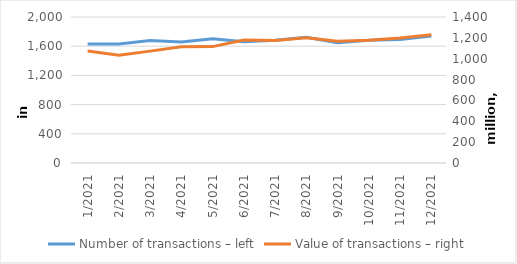
| Category | Number of transactions – left |
|---|---|
| 1/2021 | 1629135 |
| 2/2021 | 1628621 |
| 3/2021 | 1679240 |
| 4/2021 | 1657111 |
| 5/2021 | 1700664 |
| 6/2021 | 1659911 |
| 7/2021 | 1680493 |
| 8/2021 | 1723302 |
| 9/2021 | 1648057 |
| 10/2021 | 1679999 |
| 11/2021 | 1692817 |
| 12/2021 | 1737910 |